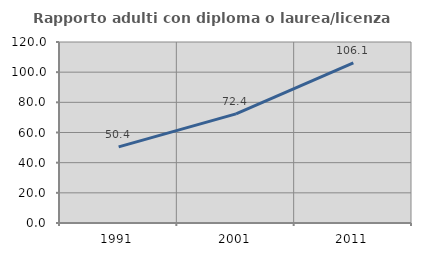
| Category | Rapporto adulti con diploma o laurea/licenza media  |
|---|---|
| 1991.0 | 50.449 |
| 2001.0 | 72.356 |
| 2011.0 | 106.145 |